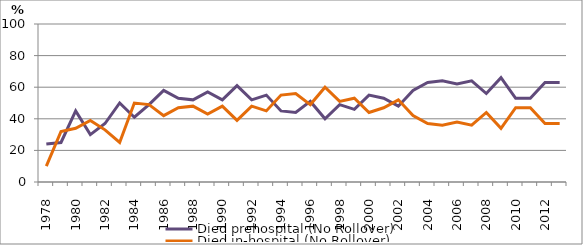
| Category | Died prehospital (No Rollover) | Died in-hospital (No Rollover) |
|---|---|---|
| 1978.0 | 24 | 10 |
| 1979.0 | 25 | 32 |
| 1980.0 | 45 | 34 |
| 1981.0 | 30 | 39 |
| 1982.0 | 37 | 33 |
| 1983.0 | 50 | 25 |
| 1984.0 | 41 | 50 |
| 1985.0 | 49 | 49 |
| 1986.0 | 58 | 42 |
| 1987.0 | 53 | 47 |
| 1988.0 | 52 | 48 |
| 1989.0 | 57 | 43 |
| 1990.0 | 52 | 48 |
| 1991.0 | 61 | 39 |
| 1992.0 | 52 | 48 |
| 1993.0 | 55 | 45 |
| 1994.0 | 45 | 55 |
| 1995.0 | 44 | 56 |
| 1996.0 | 51 | 49 |
| 1997.0 | 40 | 60 |
| 1998.0 | 49 | 51 |
| 1999.0 | 46 | 53 |
| 2000.0 | 55 | 44 |
| 2001.0 | 53 | 47 |
| 2002.0 | 48 | 52 |
| 2003.0 | 58 | 42 |
| 2004.0 | 63 | 37 |
| 2005.0 | 64 | 36 |
| 2006.0 | 62 | 38 |
| 2007.0 | 64 | 36 |
| 2008.0 | 56 | 44 |
| 2009.0 | 66 | 34 |
| 2010.0 | 53 | 47 |
| 2011.0 | 53 | 47 |
| 2012.0 | 63 | 37 |
| 2013.0 | 63 | 37 |